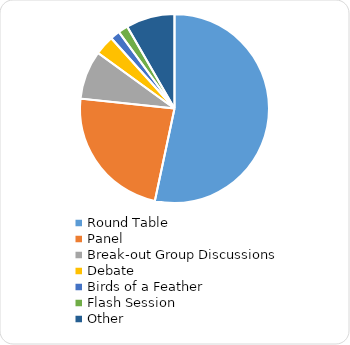
| Category | Format |
|---|---|
| Round Table | 32 |
| Panel | 14 |
| Break-out Group Discussions | 5 |
| Debate | 2 |
| Birds of a Feather | 1 |
| Flash Session | 1 |
| Other | 5 |